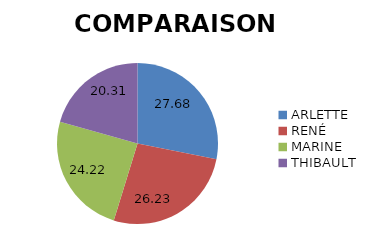
| Category | IMC |
|---|---|
| ARLETTE | 27.682 |
| RENÉ | 26.235 |
| MARINE | 24.221 |
| THIBAULT | 20.312 |